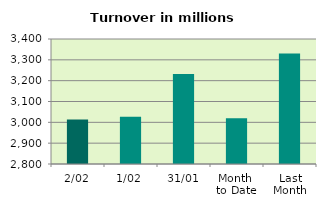
| Category | Series 0 |
|---|---|
| 2/02 | 3013.212 |
| 1/02 | 3027.102 |
| 31/01 | 3231.874 |
| Month 
to Date | 3020.157 |
| Last
Month | 3330.335 |